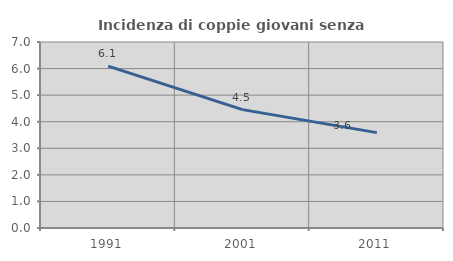
| Category | Incidenza di coppie giovani senza figli |
|---|---|
| 1991.0 | 6.09 |
| 2001.0 | 4.455 |
| 2011.0 | 3.589 |